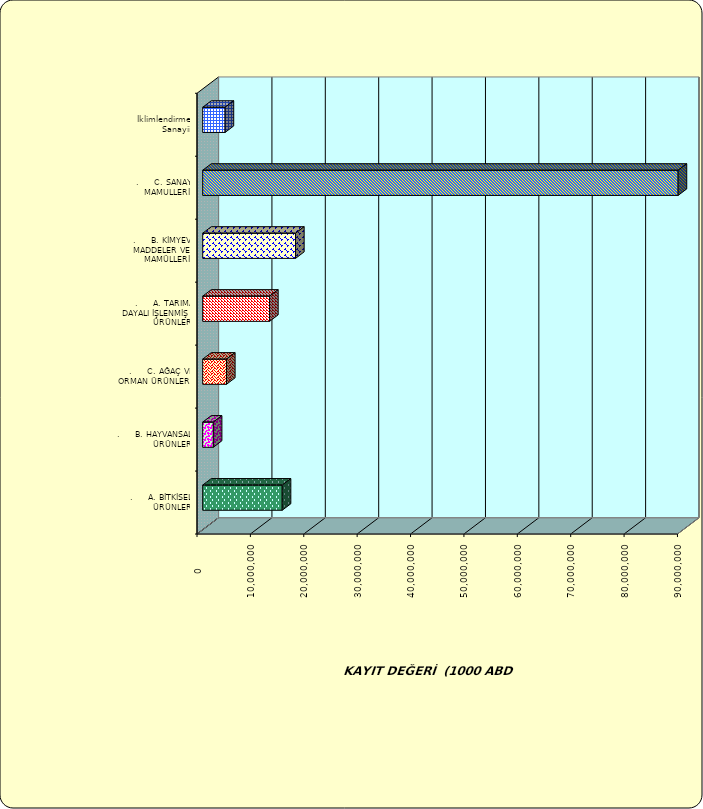
| Category | Series 0 |
|---|---|
| .     A. BİTKİSEL ÜRÜNLER | 14895862.035 |
| .     B. HAYVANSAL ÜRÜNLER | 1987977.762 |
| .     C. AĞAÇ VE ORMAN ÜRÜNLERİ | 4456532.247 |
| .     A. TARIMA DAYALI İŞLENMİŞ ÜRÜNLER | 12525373.404 |
| .     B. KİMYEVİ MADDELER VE MAMÜLLERİ | 17394997.915 |
| .     C. SANAYİ MAMULLERİ | 89059222.376 |
|  İklimlendirme Sanayii | 4195938.149 |